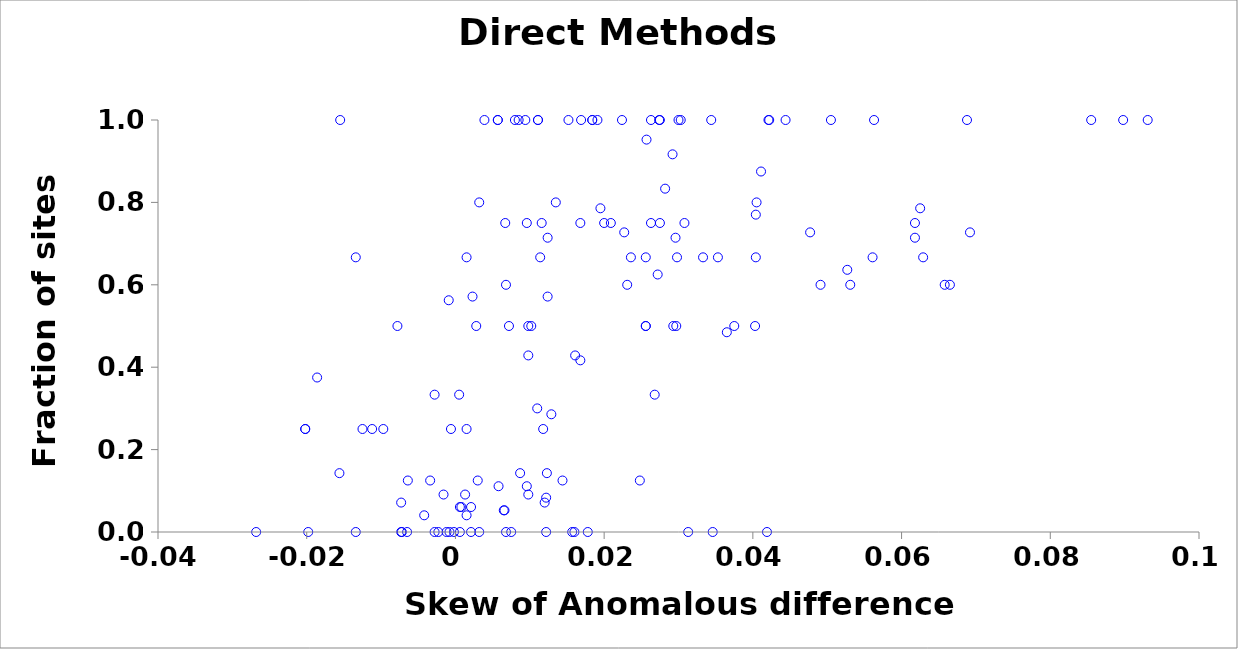
| Category | LLGC |
|---|---|
| -0.0134 | 0 |
| -0.0155 | 1 |
| -0.0073 | 0 |
| 0.0313 | 0 |
| 0.0085 | 1 |
| 0.0224 | 1 |
| 0.0184 | 1 |
| -0.0198 | 0 |
| 0.0353 | 0.667 |
| 0.0268 | 0.333 |
| 0.0404 | 0.667 |
| 0.0068 | 0 |
| -0.0028 | 0.333 |
| -0.0065 | 0 |
| 0.0039 | 1 |
| -0.0134 | 0.667 |
| 0.0256 | 0.667 |
| 0.0111 | 1 |
| 0.0629 | 0.667 |
| 0.0898 | 1 |
| 0.0015 | 0.667 |
| 0.0236 | 0.667 |
| 0.0333 | 0.667 |
| -0.0125 | 0.25 |
| 0.0032 | 0 |
| -0.0097 | 0.25 |
| 0.0118 | 0.25 |
| 0.0419 | 0 |
| 0.0293 | 0.5 |
| 0.0375 | 0.5 |
| 0.0256 | 0.5 |
| -0.0078 | 0.5 |
| 0.0098 | 0.5 |
| -0.0268 | 0 |
| 0.0067 | 0.75 |
| 0.0563 | 1 |
| 0.0094 | 1 |
| 0.0096 | 0.75 |
| 0.0015 | 0.25 |
| 0.03 | 1 |
| 0.0028 | 0.5 |
| 0.0505 | 1 |
| 0.0168 | 0.75 |
| 0.0344 | 1 |
| 0.0111 | 1 |
| 0.0057 | 1 |
| 0.0169 | 1 |
| 0.008 | 1 |
| 0.0116 | 0.75 |
| -0.0072 | 0 |
| 0.0665 | 0.6 |
| 0.0658 | 0.6 |
| 0.016 | 0 |
| 0.0531 | 0.6 |
| 0.0068 | 0.6 |
| 0.0032 | 0.8 |
| 0.0057 | 1 |
| 0.0135 | 0.8 |
| 0.0021 | 0 |
| 0.0157 | 0 |
| 0.1075 | 0.6 |
| 0.0303 | 1 |
| 0.0931 | 1 |
| 0.0688 | 1 |
| 0.0191 | 1 |
| 0.0184 | 1 |
| 0.0152 | 1 |
| 0.0421 | 1 |
| 0.0275 | 1 |
| 0.0444 | 1 |
| 0.161 | 1 |
| 0.1996 | 1 |
| 0.1996 | 1 |
| 0.0855 | 1 |
| 0.1151 | 1 |
| 0.0123 | 0.143 |
| 0.0023 | 0.571 |
| 0.0087 | 0.143 |
| 0.0124 | 0.571 |
| 0.0129 | 0.286 |
| 0.0161 | 0.429 |
| -0.0064 | 0.125 |
| 0.003 | 0.125 |
| -0.0202 | 0.25 |
| -0.0006 | 0.25 |
| -0.0202 | 0.25 |
| -0.0112 | 0.25 |
| 0.0422 | 1 |
| 0.0346 | 0 |
| 0.0122 | 0 |
| 0.0256 | 0.5 |
| -0.0034 | 0.125 |
| -0.0186 | 0.375 |
| 0.0075 | 0 |
| -0.0028 | 0 |
| 0.0274 | 1 |
| -0.0012 | 0 |
| 0.0297 | 0.5 |
| 0.0178 | 0 |
| 0.0144 | 0.125 |
| 0.0006 | 0 |
| 0.0411 | 0.875 |
| 0.0263 | 1 |
| -0.0002 | 0 |
| 0.0618 | 0.75 |
| -0.0008 | 0 |
| 0.0298 | 0.667 |
| 0.0114 | 0.667 |
| 0.0561 | 0.667 |
| 0.011 | 0.3 |
| -0.0023 | 0 |
| 0.0102 | 0.5 |
| 0.0231 | 0.6 |
| 0.0072 | 0.5 |
| 0.0491 | 0.6 |
| 0.0405 | 0.8 |
| 0.0403 | 0.5 |
| 0.0013 | 0.091 |
| 0.0098 | 0.091 |
| 0.0227 | 0.727 |
| 0.0527 | 0.636 |
| 0.0692 | 0.727 |
| 0.0292 | 0.917 |
| 0.0263 | 0.75 |
| 0.0275 | 0.75 |
| 0.0122 | 0.083 |
| 0.0168 | 0.417 |
| 0.0209 | 0.75 |
| 0.02 | 0.75 |
| -0.0156 | 0.143 |
| 0.012 | 0.071 |
| -0.0073 | 0.071 |
| 0.0098 | 0.429 |
| 0.0195 | 0.786 |
| 0.0618 | 0.714 |
| 0.0625 | 0.786 |
| 0.0124 | 0.714 |
| 0.1151 | 0.786 |
| 0.2188 | 0.786 |
| 0.1455 | 0.786 |
| 0.0272 | 0.625 |
| 0.0248 | 0.125 |
| -0.0009 | 0.562 |
| 0.0308 | 0.75 |
| 0.0282 | 0.833 |
| 0.1568 | 0.833 |
| 0.0296 | 0.714 |
| 0.0257 | 0.952 |
| -0.0016 | 0.091 |
| 0.0477 | 0.727 |
| 0.0058 | 0.111 |
| 0.0005 | 0.333 |
| 0.0096 | 0.111 |
| 0.0021 | 0.061 |
| 0.0008 | 0.061 |
| 0.0365 | 0.485 |
| 0.0066 | 0.053 |
| 0.0065 | 0.053 |
| 0.0006 | 0.061 |
| 0.0015 | 0.041 |
| -0.0042 | 0.041 |
| 0.0404 | 0.77 |